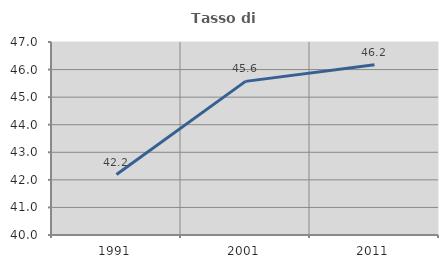
| Category | Tasso di occupazione   |
|---|---|
| 1991.0 | 42.194 |
| 2001.0 | 45.572 |
| 2011.0 | 46.172 |